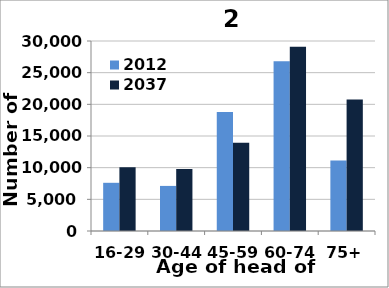
| Category | 2012 | 2037 |
|---|---|---|
| 16-29 | 7611 | 10069 |
| 30-44 | 7119 | 9776 |
| 45-59 | 18784 | 13943 |
| 60-74 | 26788 | 29084 |
| 75+ | 11131 | 20746 |